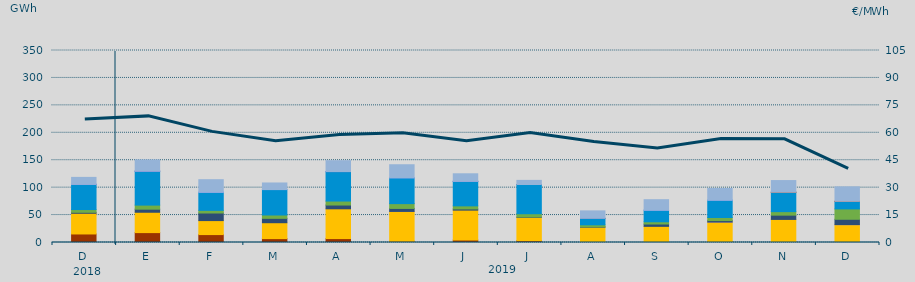
| Category | Carbón | Ciclo Combinado | Cogeneración | Consumo Bombeo | Eólica | Hidráulica | Nuclear | Otras Renovables | Solar fotovoltaica | Turbinación bombeo |
|---|---|---|---|---|---|---|---|---|---|---|
| D | 15554.9 | 37706.5 | 0 | 1783.4 | 5010 | 45893.5 | 75.9 | 3.2 | 0 | 12660 |
| E | 18038.9 | 37091.8 | 0 | 5584.1 | 7459.5 | 61806.6 | 125.1 | 3.8 | 0 | 20506.3 |
| F | 14436.3 | 25499.5 | 0 | 13820.1 | 4854.6 | 33013.5 | 0 | 95.8 | 0 | 22781.5 |
| M | 7069 | 28989.6 | 0 | 7976 | 6086 | 46385.5 | 0 | 4 | 0 | 12004.9 |
| A | 7133.3 | 54294.6 | 0 | 6877.3 | 7238.7 | 53741.4 | 18.8 | 1.7 | 0 | 19863.3 |
| M | 2251.7 | 54358.5 | 20 | 5480.5 | 8758.9 | 47108.2 | 0 | 17.2 | 0 | 23767.4 |
| J | 4465.4 | 54530.5 | 0 | 2188.8 | 5586 | 44612.2 | 174.7 | 1.4 | 0 | 13701.1 |
| J | 3289.6 | 42570.7 | 0 | 636.6 | 5909.9 | 53272.1 | 42.5 | 0 | 0 | 7519.8 |
| A | 446.5 | 27502.9 | 0 | 624.2 | 3670.3 | 11750 | 1 | 0 | 0 | 13635.5 |
| S | 460.6 | 28967.7 | 0 | 4234.7 | 4105.5 | 21199.2 | 0 | 2.6 | 0 | 19063.6 |
| O | 1718.2 | 35506.1 | 18 | 2744.7 | 5556.7 | 31702.3 | 0 | 0.8 | 0 | 21165.2 |
| N | 1857.3 | 40203.9 | 0 | 7774.6 | 6415.7 | 35320.4 | 90 | 0 | 4.8 | 21237.9 |
| D | 554 | 31978.8 | 44.6 | 9751.3 | 18898.5 | 13540.8 | 366.6 | 0 | 2.1 | 26259.7 |